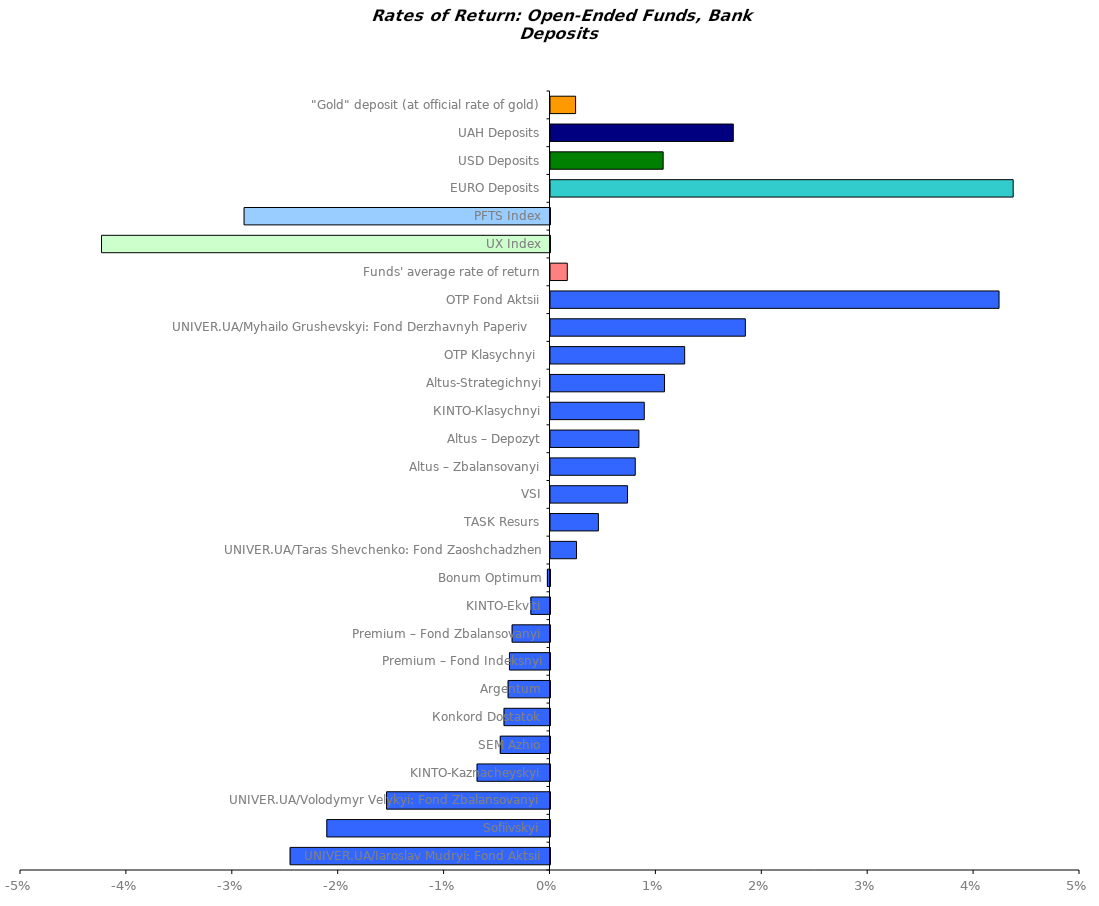
| Category | Series 0 |
|---|---|
| UNIVER.UA/Iaroslav Mudryi: Fond Aktsii | -0.025 |
| Sofiivskyi | -0.021 |
| UNIVER.UA/Volodymyr Velykyi: Fond Zbalansovanyi | -0.015 |
| KINTO-Kaznacheyskyi | -0.007 |
| SEM Azhio | -0.005 |
| Коnkord Dostatok | -0.004 |
| Argentum | -0.004 |
| Premium – Fond Indeksnyi | -0.004 |
| Premium – Fond Zbalansovanyi | -0.004 |
| KINTO-Ekviti | -0.002 |
| Bonum Optimum | 0 |
| UNIVER.UA/Taras Shevchenko: Fond Zaoshchadzhen | 0.002 |
| TASK Resurs | 0.005 |
| VSI | 0.007 |
| Altus – Zbalansovanyi | 0.008 |
| Altus – Depozyt | 0.008 |
| КІNTO-Кlasychnyi | 0.009 |
| Altus-Strategichnyi | 0.011 |
| OTP Klasychnyi  | 0.013 |
| UNIVER.UA/Myhailo Grushevskyi: Fond Derzhavnyh Paperiv    | 0.018 |
| OTP Fond Aktsii | 0.042 |
| Funds' average rate of return | 0.002 |
| UX Index | -0.042 |
| PFTS Index | -0.029 |
| EURO Deposits | 0.044 |
| USD Deposits | 0.011 |
| UAH Deposits | 0.017 |
| "Gold" deposit (at official rate of gold) | 0.002 |